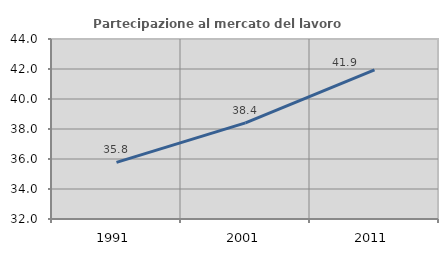
| Category | Partecipazione al mercato del lavoro  femminile |
|---|---|
| 1991.0 | 35.779 |
| 2001.0 | 38.405 |
| 2011.0 | 41.942 |